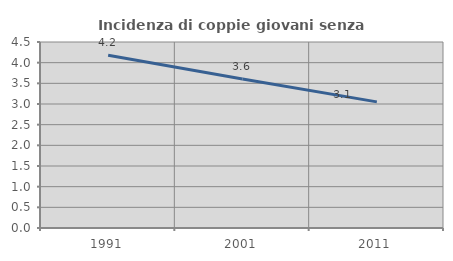
| Category | Incidenza di coppie giovani senza figli |
|---|---|
| 1991.0 | 4.179 |
| 2001.0 | 3.607 |
| 2011.0 | 3.052 |